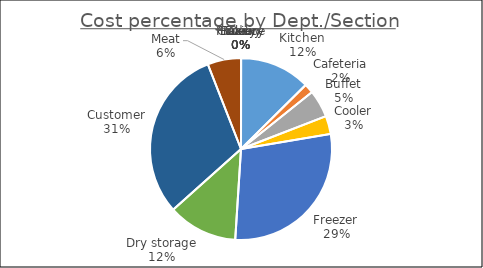
| Category | Series 0 |
|---|---|
| Kitchen | 1.678 |
| Cafeteria | 0.223 |
| Buffet | 0.651 |
| Cooler | 0.429 |
| Freezer | 3.826 |
| Dry storage | 1.651 |
| Customer | 4.094 |
| Meat | 0.792 |
| Deli | 0 |
| Bakery | 0 |
| Dairy | 0 |
| Produce | 0 |
| Frozen | 0 |
| Grocery | 0 |